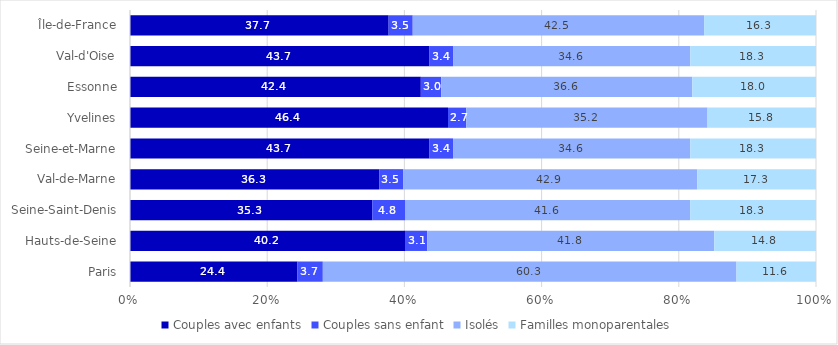
| Category | Couples avec enfants | Couples sans enfant | Isolés | Familles monoparentales |
|---|---|---|---|---|
| Paris | 24.42 | 3.689 | 60.304 | 11.587 |
| Hauts-de-Seine | 40.188 | 3.135 | 41.843 | 14.834 |
| Seine-Saint-Denis | 35.307 | 4.782 | 41.564 | 18.347 |
| Val-de-Marne | 36.326 | 3.525 | 42.854 | 17.295 |
| Seine-et-Marne | 43.664 | 3.427 | 34.577 | 18.332 |
| Yvelines | 46.359 | 2.65 | 35.179 | 15.811 |
| Essonne | 42.394 | 2.971 | 36.607 | 18.027 |
| Val-d'Oise | 43.664 | 3.427 | 34.577 | 18.332 |
| Île-de-France | 37.704 | 3.511 | 42.476 | 16.309 |